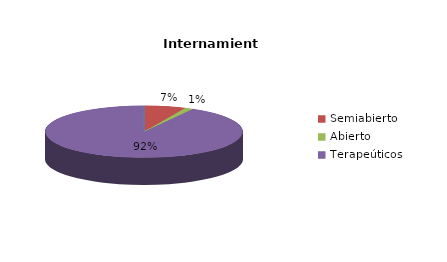
| Category | Series 0 |
|---|---|
| Cerrado | 0 |
| Semiabierto | 5 |
| Abierto | 1 |
| Terapeúticos | 68 |